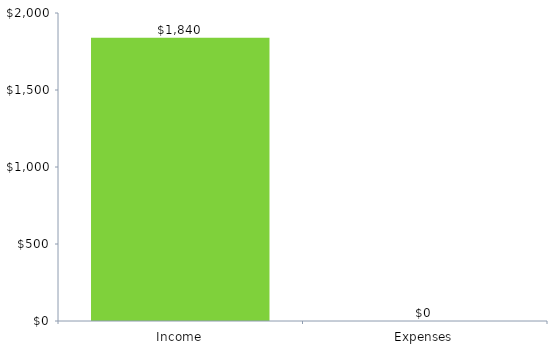
| Category | ChartData |
|---|---|
| 0 | 1840 |
| 1 | 0 |